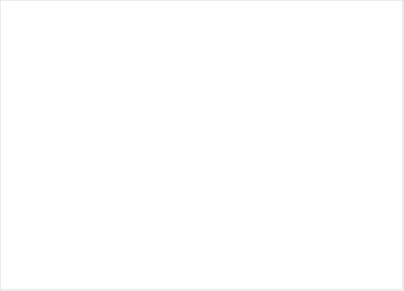
| Category | Total |
|---|---|
| Develop/diversify early childhood workforce | 1326924.97 |
| Enhance effectiveness of overall system of early care and education | 2068472.78 |
| Increase quality | 2900384.78 |
| Increase slots for enrollment | 1861641 |
| Support families | 2927237.48 |